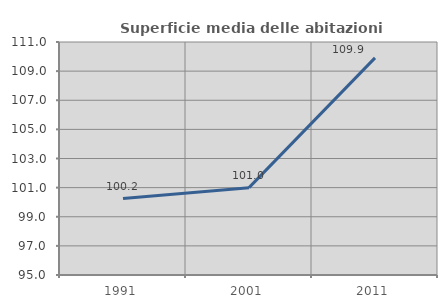
| Category | Superficie media delle abitazioni occupate |
|---|---|
| 1991.0 | 100.248 |
| 2001.0 | 100.997 |
| 2011.0 | 109.908 |